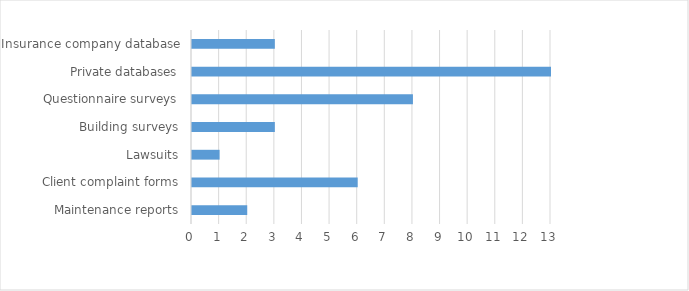
| Category | Number of Articles |
|---|---|
| Insurance company database | 3 |
| Private databases | 13 |
| Questionnaire surveys | 8 |
| Building surveys | 3 |
| Lawsuits | 1 |
| Client complaint forms | 6 |
| Maintenance reports | 2 |